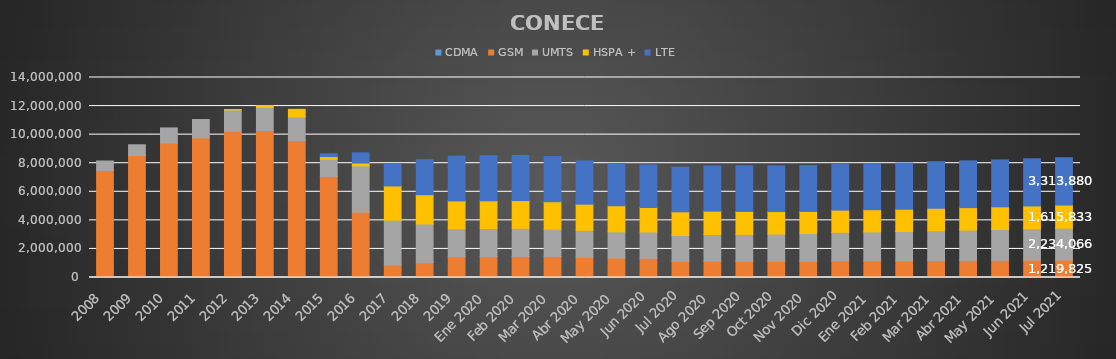
| Category | CDMA | GSM | UMTS | HSPA + | LTE |
|---|---|---|---|---|---|
| 2008 | 0 | 7499370 | 656989 | 0 | 0 |
| 2009 | 0 | 8532691 | 758577 | 0 | 0 |
| 2010 | 0 | 9419193 | 1051309 | 0 | 0 |
| 2011 | 0 | 9774865 | 1282451 | 0 | 0 |
| 2012 | 0 | 10252457 | 1484003 | 21446 | 0 |
| 2013 | 0 | 10287259 | 1622034 | 121593 | 0 |
| 2014 | 0 | 9581956 | 1664758 | 525306 | 0 |
| 2015 | 0 | 7065313 | 1214567 | 183109 | 195630 |
| 2016 | 0 | 4571999 | 3240700 | 201567 | 712557 |
| 2017 | 0 | 873346 | 3135577 | 2399460 | 1551880 |
| 2018 | 0 | 1039373 | 2706058 | 2049418 | 2453201 |
| 2019 | 0 | 1452334 | 1970422 | 1937931 | 3132367 |
| Ene 2020 | 0 | 1459613 | 1969054 | 1940173 | 3156102 |
| Feb 2020 | 0 | 1462078 | 1980238 | 1944552 | 3160568 |
| Mar 2020 | 0 | 1463245 | 1917544 | 1923263 | 3161040 |
| Abr 2020 | 0 | 1410378 | 1890436 | 1834080 | 3022990 |
| May 2020 | 0 | 1360597 | 1835391 | 1826578 | 2965233 |
| Jun 2020 | 0 | 1343983 | 1840529 | 1715037 | 2978022 |
| Jul 2020 | 0 | 1131825 | 1809662 | 1655750 | 3120834 |
| Ago 2020 | 0 | 1137328 | 1873506 | 1633388 | 3162366 |
| Sep 2020 | 0 | 1135521 | 1884095 | 1604661 | 3197600 |
| Oct 2020 | 0 | 1129801 | 1912851 | 1573379 | 3194210 |
| Nov 2020 | 0 | 1132158 | 1954284 | 1539405 | 3210249 |
| Dic 2020 | 0 | 1158751 | 2009264 | 1548440 | 3212798 |
| Ene 2021 | 0 | 1162024 | 2031223 | 1552277 | 3219750 |
| Feb 2021 | 0 | 1169065 | 2048617 | 1559907 | 3235305 |
| Mar 2021 | 0 | 1181823 | 2091574 | 1572077 | 3258399 |
| Abr 2021 | 0 | 1194833 | 2117779 | 1576757 | 3274515 |
| May 2021 | 0 | 1204467 | 2156961 | 1584433 | 3281752 |
| Jun 2021 | 0 | 1213946 | 2200564 | 1593003 | 3300402 |
| Jul 2021 | 0 | 1219825 | 2234066 | 1615833 | 3313880 |